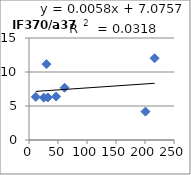
| Category | IF370/a370 |
|---|---|
| 25.5 | 6.23 |
| 61.3 | 7.69 |
| 11.7 | 6.34 |
| 216.5 | 12.02 |
| 46.8 | 6.39 |
| 32.5 | 6.26 |
| 200.8 | 4.18 |
| 30.1 | 11.15 |